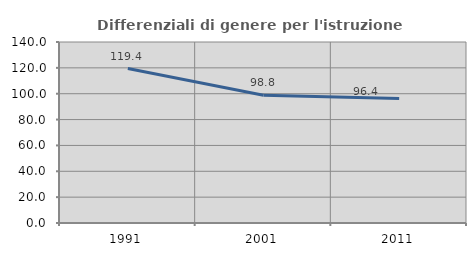
| Category | Differenziali di genere per l'istruzione superiore |
|---|---|
| 1991.0 | 119.43 |
| 2001.0 | 98.763 |
| 2011.0 | 96.376 |